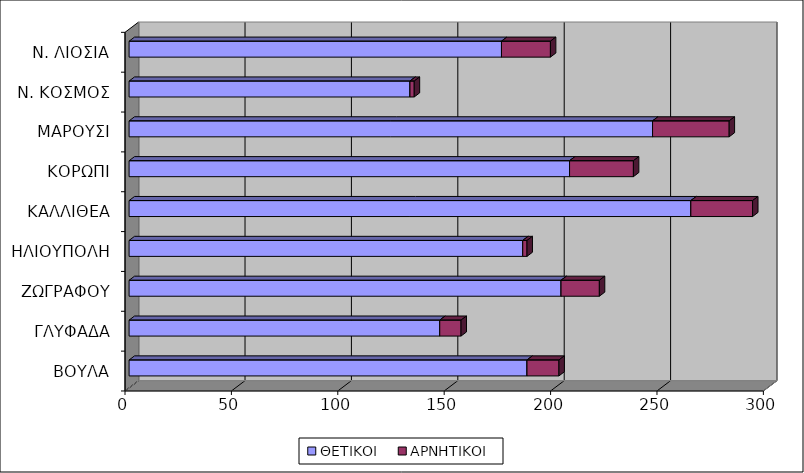
| Category | ΘΕΤΙΚΟΙ | ΑΡΝΗΤΙΚΟΙ |
|---|---|---|
| ΒΟΥΛΑ | 187 | 15 |
| ΓΛΥΦΑΔΑ | 146 | 10 |
| ΖΩΓΡΑΦΟΥ | 203 | 18 |
| ΗΛΙΟΥΠΟΛΗ | 185 | 2 |
| ΚΑΛΛΙΘΕΑ | 264 | 29 |
| ΚΟΡΩΠΙ | 207 | 30 |
| ΜΑΡΟΥΣΙ | 246 | 36 |
| Ν. ΚΟΣΜΟΣ | 132 | 2 |
| Ν. ΛΙΟΣΙΑ | 175 | 23 |